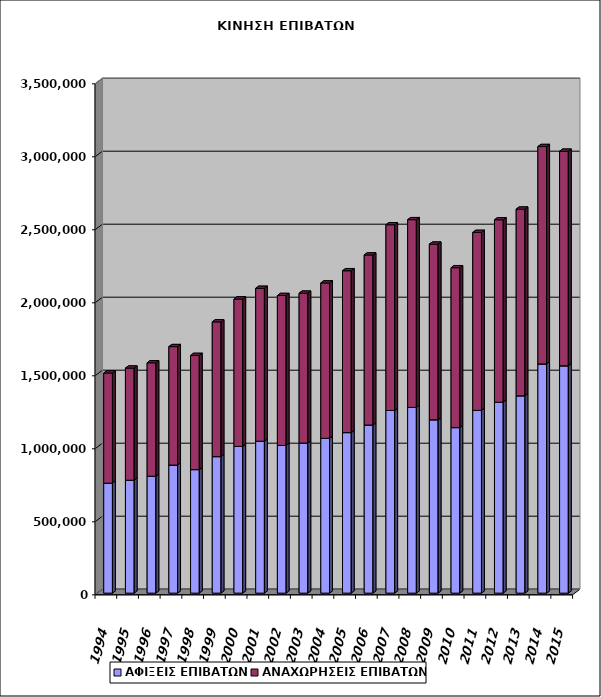
| Category | ΑΦΙΞΕΙΣ ΕΠΙΒΑΤΩΝ | ΑΝΑΧΩΡΗΣΕΙΣ ΕΠΙΒΑΤΩΝ |
|---|---|---|
| 1994.0 | 753040 | 754601 |
| 1995.0 | 773275 | 767859 |
| 1996.0 | 800500 | 777202 |
| 1997.0 | 877037 | 811393 |
| 1998.0 | 846092 | 781834 |
| 1999.0 | 935030 | 922715 |
| 2000.0 | 1005051 | 1009593 |
| 2001.0 | 1040545 | 1046908 |
| 2002.0 | 1011462 | 1026911 |
| 2003.0 | 1027767 | 1026478 |
| 2004.0 | 1060064 | 1064434 |
| 2005.0 | 1099516 | 1108560 |
| 2006.0 | 1151395 | 1164626 |
| 2007.0 | 1251308 | 1271711 |
| 2008.0 | 1271776 | 1285900 |
| 2009.0 | 1187233 | 1203072 |
| 2010.0 | 1133704 | 1094976 |
| 2011.0 | 1251433 | 1219070 |
| 2012.0 | 1307537 | 1249551 |
| 2013.0 | 1351378 | 1278590 |
| 2014.0 | 1569814 | 1488894 |
| 2015.0 | 1556788 | 1469732 |